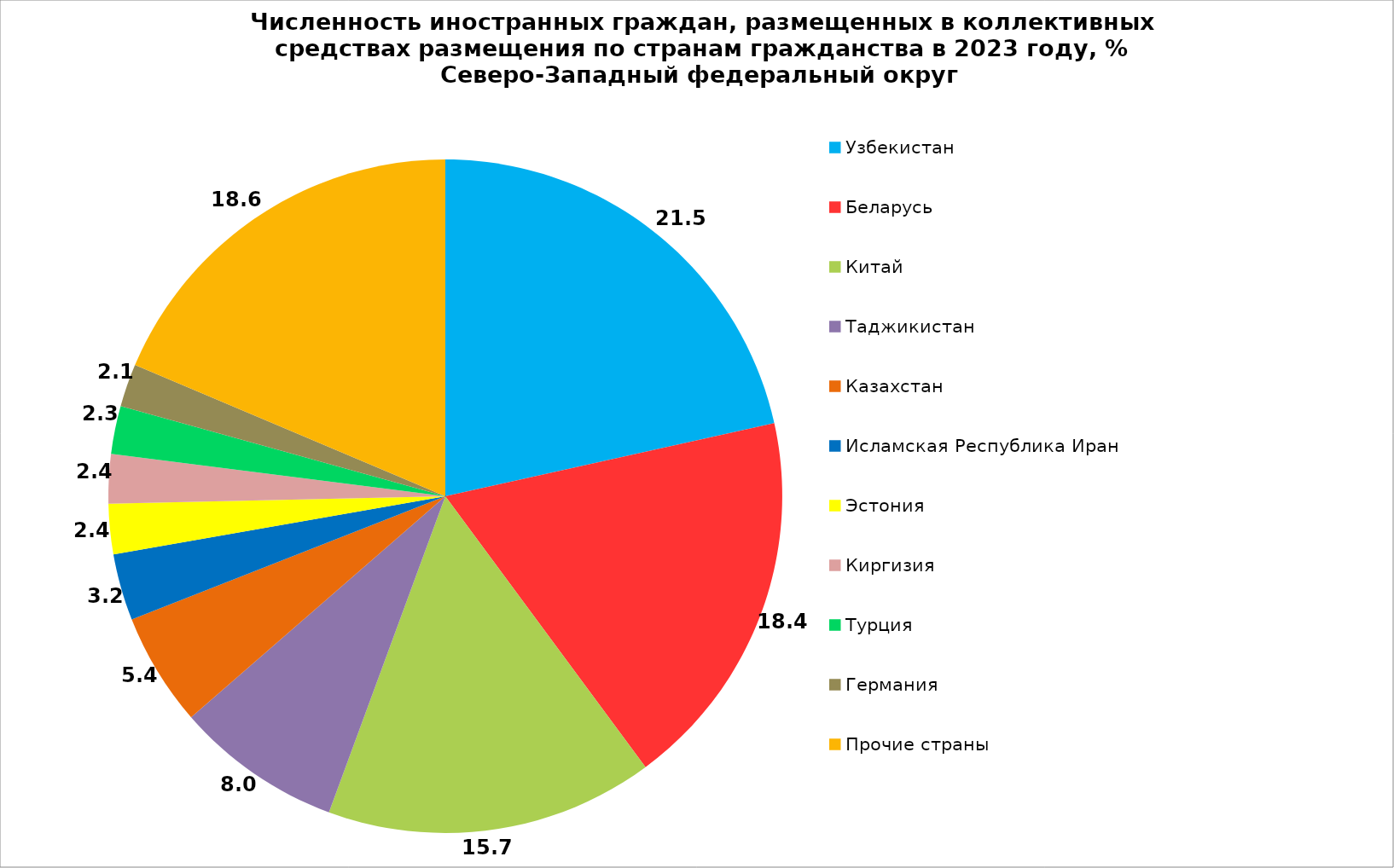
| Category | Series 0 |
|---|---|
| Узбекистан | 21.519 |
| Беларусь | 18.356 |
| Китай | 15.738 |
| Таджикистан | 7.992 |
| Казахстан | 5.431 |
| Исламская Республика Иран | 3.199 |
| Эстония | 2.412 |
| Киргизия | 2.366 |
| Турция | 2.302 |
| Германия | 2.055 |
| Прочие страны | 18.629 |